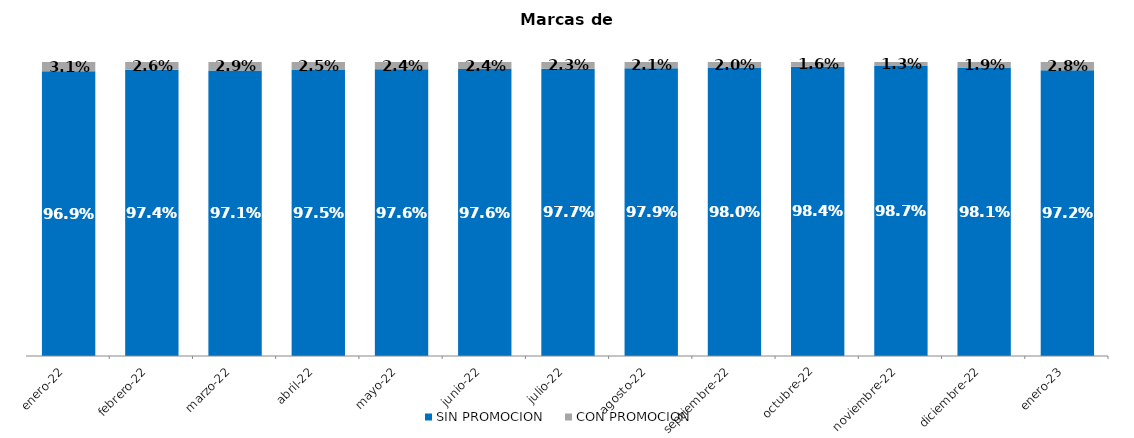
| Category | SIN PROMOCION   | CON PROMOCION   |
|---|---|---|
| 2022-01-01 | 0.969 | 0.031 |
| 2022-02-01 | 0.974 | 0.026 |
| 2022-03-01 | 0.971 | 0.029 |
| 2022-04-01 | 0.975 | 0.025 |
| 2022-05-01 | 0.976 | 0.024 |
| 2022-06-01 | 0.976 | 0.024 |
| 2022-07-01 | 0.977 | 0.023 |
| 2022-08-01 | 0.979 | 0.021 |
| 2022-09-01 | 0.98 | 0.02 |
| 2022-10-01 | 0.984 | 0.016 |
| 2022-11-01 | 0.987 | 0.013 |
| 2022-12-01 | 0.981 | 0.019 |
| 2023-01-01 | 0.972 | 0.028 |